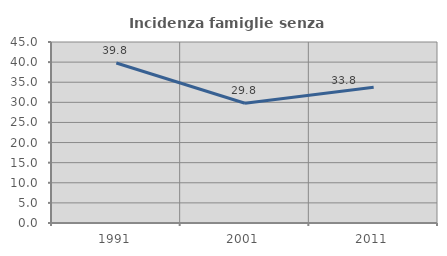
| Category | Incidenza famiglie senza nuclei |
|---|---|
| 1991.0 | 39.773 |
| 2001.0 | 29.762 |
| 2011.0 | 33.766 |